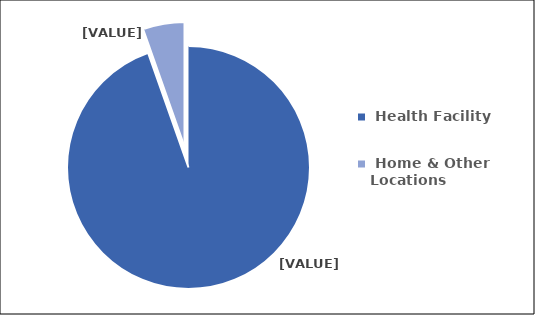
| Category | Series 0 |
|---|---|
|  Health Facility  | 94.605 |
|  Home & Other Locations  | 5.395 |